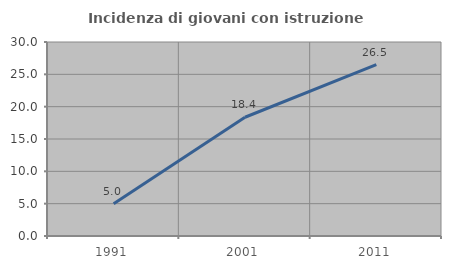
| Category | Incidenza di giovani con istruzione universitaria |
|---|---|
| 1991.0 | 5 |
| 2001.0 | 18.364 |
| 2011.0 | 26.49 |